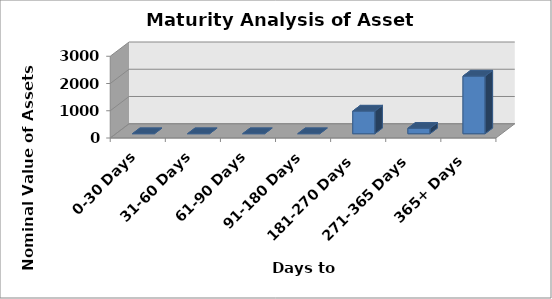
| Category | Nominal |
|---|---|
| 0-30 Days | 0 |
| 31-60 Days | 0 |
| 61-90 Days | 0 |
| 91-180 Days | 0 |
| 181-270 Days | 830869505 |
| 271-365 Days | 200000000 |
| 365+ Days | 2114953703 |